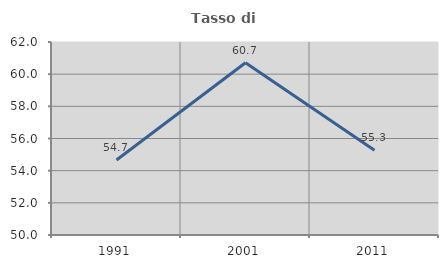
| Category | Tasso di occupazione   |
|---|---|
| 1991.0 | 54.664 |
| 2001.0 | 60.71 |
| 2011.0 | 55.274 |